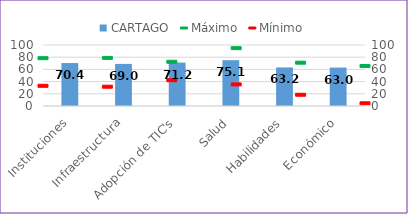
| Category | CARTAGO |
|---|---|
| Instituciones | 70.407 |
| Infraestructura | 69.021 |
| Adopción de TIC's | 71.17 |
| Salud | 75.127 |
| Habilidades | 63.204 |
| Económico | 62.979 |